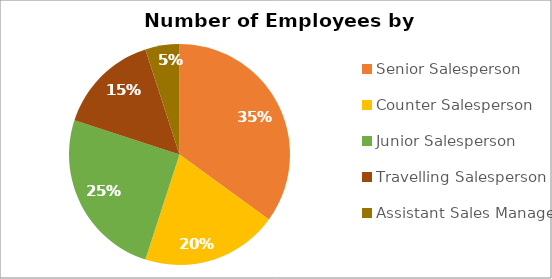
| Category | Count |
|---|---|
| Senior Salesperson | 7 |
| Counter Salesperson | 4 |
| Junior Salesperson | 5 |
| Travelling Salesperson | 3 |
| Assistant Sales Manager | 1 |